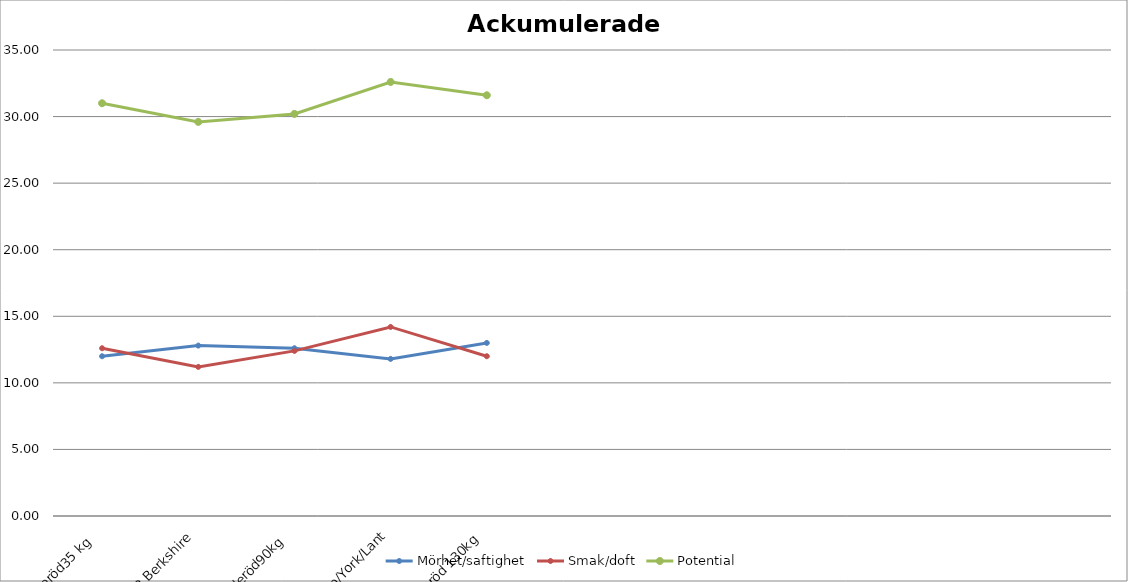
| Category | Mörhet/saftighet | Smak/doft | Potential |
|---|---|---|---|
| 1.Linderöd35 kg  | 12 | 12.6 | 31 |
| 2.Berkshire | 12.8 | 11.2 | 29.6 |
| 3.Linderöd90kg  | 12.6 | 12.4 | 30.2 |
| 4.Hamp/York/Lant | 11.8 | 14.2 | 32.6 |
| 5.Linderöd 130kg | 13 | 12 | 31.6 |